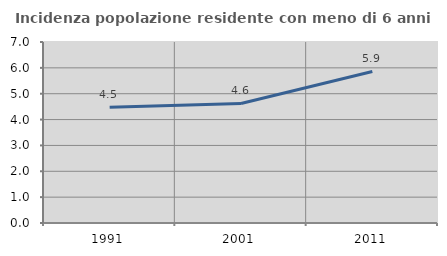
| Category | Incidenza popolazione residente con meno di 6 anni |
|---|---|
| 1991.0 | 4.478 |
| 2001.0 | 4.622 |
| 2011.0 | 5.859 |